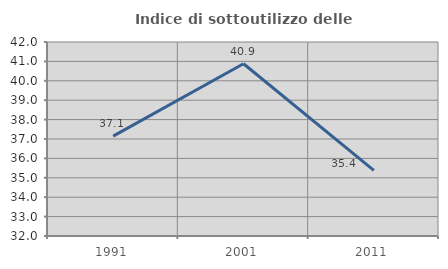
| Category | Indice di sottoutilizzo delle abitazioni  |
|---|---|
| 1991.0 | 37.146 |
| 2001.0 | 40.878 |
| 2011.0 | 35.383 |